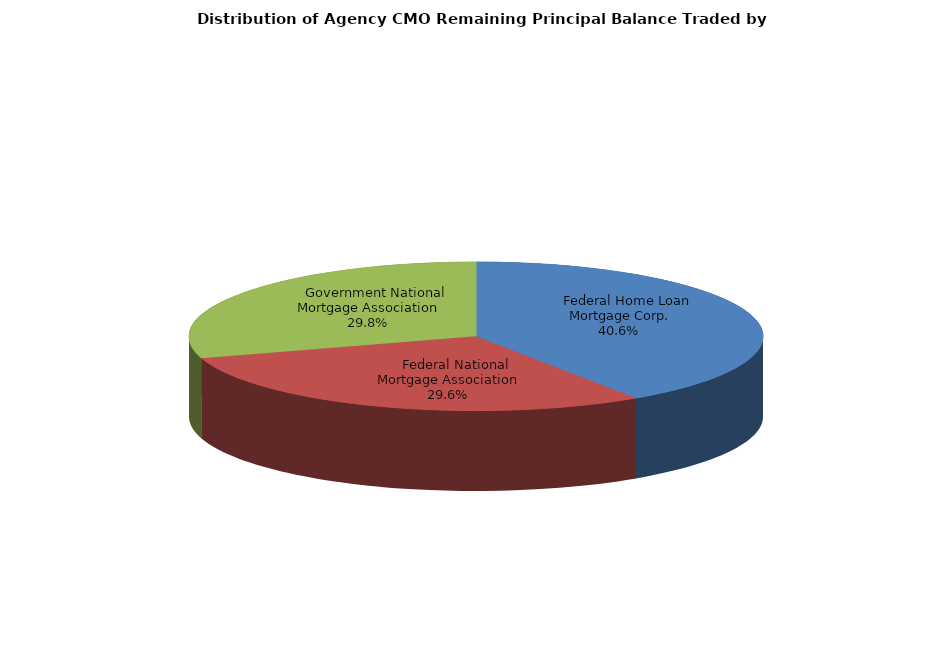
| Category | Series 0 |
|---|---|
|     Federal Home Loan Mortgage Corp. | 1605421519.708 |
|     Federal National Mortgage Association | 1171468331.4 |
|     Government National Mortgage Association | 1177082552.002 |